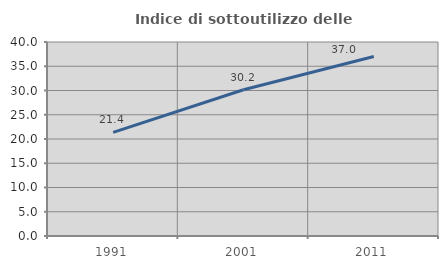
| Category | Indice di sottoutilizzo delle abitazioni  |
|---|---|
| 1991.0 | 21.371 |
| 2001.0 | 30.157 |
| 2011.0 | 36.995 |